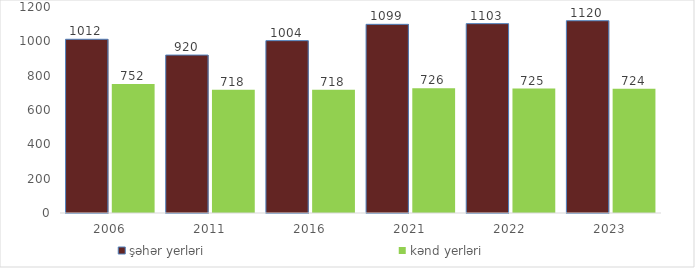
| Category | şəhər yerləri
 | kənd yerləri
 |
|---|---|---|
| 2006.0 | 1012 | 752 |
| 2011.0 | 920 | 718 |
| 2016.0 | 1004 | 718 |
| 2021.0 | 1099 | 726 |
| 2022.0 | 1103 | 725 |
| 2023.0 | 1120 | 724 |